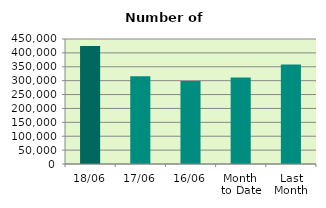
| Category | Series 0 |
|---|---|
| 18/06 | 424812 |
| 17/06 | 316222 |
| 16/06 | 299208 |
| Month 
to Date | 311804.429 |
| Last
Month | 357760.286 |